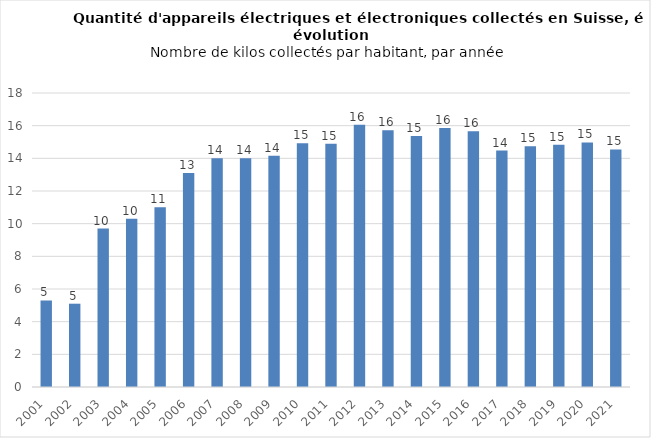
| Category | Series 0 |
|---|---|
| 2001.0 | 5.3 |
| 2002.0 | 5.1 |
| 2003.0 | 9.7 |
| 2004.0 | 10.3 |
| 2005.0 | 11 |
| 2006.0 | 13.1 |
| 2007.0 | 14 |
| 2008.0 | 14 |
| 2009.0 | 14.154 |
| 2010.0 | 14.929 |
| 2011.0 | 14.897 |
| 2012.0 | 16.059 |
| 2013.0 | 15.713 |
| 2014.0 | 15.368 |
| 2015.0 | 15.864 |
| 2016.0 | 15.654 |
| 2017.0 | 14.474 |
| 2018.0 | 14.735 |
| 2019.0 | 14.827 |
| 2020.0 | 14.971 |
| 2021.0 | 14.548 |